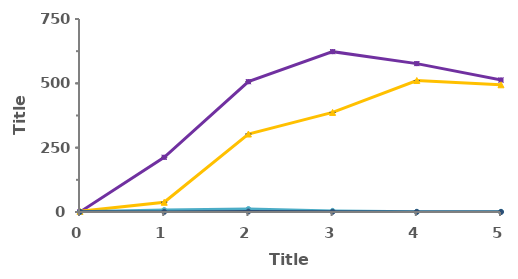
| Category | RFP dnj-21 RNAi | RFP Ctrl. | GFP dnj-21 RNAi | GFP Ctrl. |
|---|---|---|---|---|
| 0.0 | 0.4 | 2.625 | 0.533 | 0.75 |
| 1.0 | 212.571 | 37.786 | 7.429 | 0.429 |
| 2.0 | 506.438 | 303.062 | 11.438 | 1.688 |
| 3.0 | 623.125 | 387 | 4.312 | 0.8 |
| 4.0 | 576.643 | 510.933 | 0.643 | 0.333 |
| 5.0 | 512.875 | 494.333 | 0.75 | 0.067 |